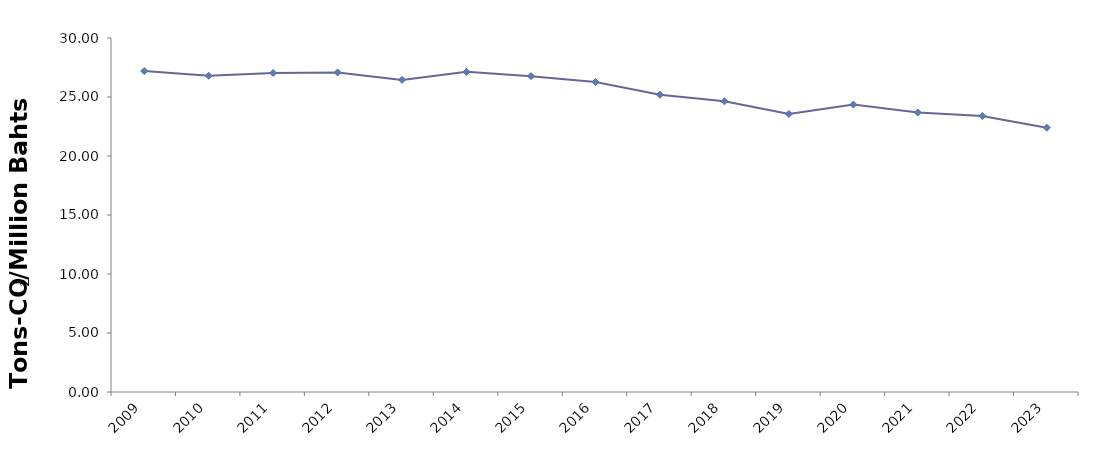
| Category | CO2/GDP
 (Tons-CO2 /  Million Bahts) |
|---|---|
| 2009 | 27.2 |
| 2010 | 26.8 |
| 2011 | 27.04 |
| 2012 | 27.084 |
| 2013 | 26.452 |
| 2014 | 27.132 |
| 2015 | 26.767 |
| 2016 | 26.267 |
| 2017 | 25.192 |
| 2018 | 24.636 |
| 2019 | 23.567 |
| 2020 | 24.36 |
| 2021 | 23.687 |
| 2022 | 23.39 |
| 2023 | 22.399 |